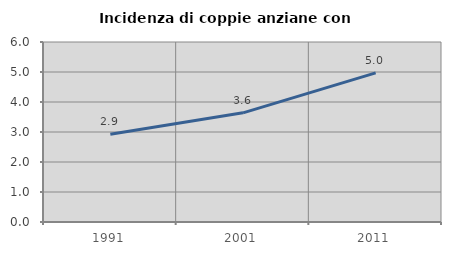
| Category | Incidenza di coppie anziane con figli |
|---|---|
| 1991.0 | 2.928 |
| 2001.0 | 3.639 |
| 2011.0 | 4.972 |